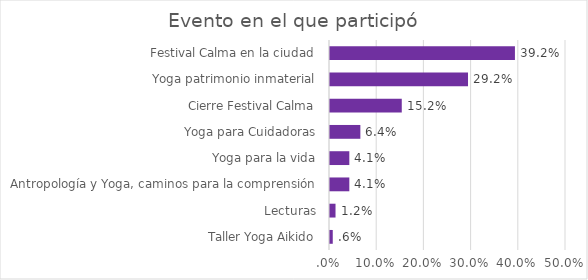
| Category | % del N de columna |
|---|---|
| Taller Yoga Aikido | 0.006 |
| Lecturas | 0.012 |
| Antropología y Yoga, caminos para la comprensión | 0.041 |
| Yoga para la vida | 0.041 |
| Yoga para Cuidadoras | 0.064 |
| Cierre Festival Calma | 0.152 |
| Yoga patrimonio inmaterial | 0.292 |
| Festival Calma en la ciudad | 0.392 |